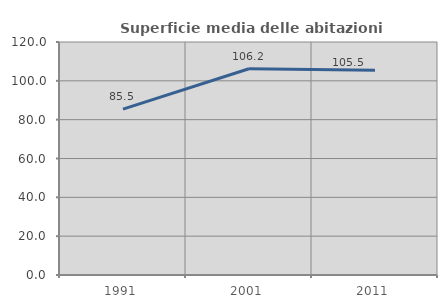
| Category | Superficie media delle abitazioni occupate |
|---|---|
| 1991.0 | 85.452 |
| 2001.0 | 106.213 |
| 2011.0 | 105.506 |